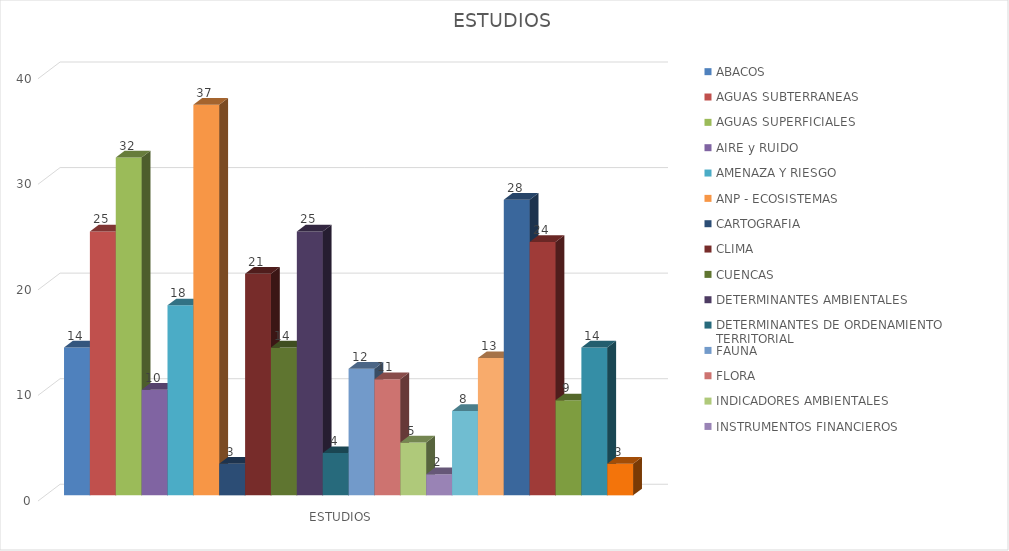
| Category | ABACOS | AGUAS SUBTERRANEAS | AGUAS SUPERFICIALES | AIRE y RUIDO | AMENAZA Y RIESGO | ANP - ECOSISTEMAS | CARTOGRAFIA  | CLIMA | CUENCAS | DETERMINANTES AMBIENTALES | DETERMINANTES DE ORDENAMIENTO TERRITORIAL | FAUNA | FLORA | INDICADORES AMBIENTALES  | INSTRUMENTOS FINANCIEROS | MINERIA | OBRAS | PGIRS | REFORESTACION | RELLENOS SANITARIOS | SECTORIALES | SUELO |
|---|---|---|---|---|---|---|---|---|---|---|---|---|---|---|---|---|---|---|---|---|---|---|
| ESTUDIOS | 14 | 25 | 32 | 10 | 18 | 37 | 3 | 21 | 14 | 25 | 4 | 12 | 11 | 5 | 2 | 8 | 13 | 28 | 24 | 9 | 14 | 3 |